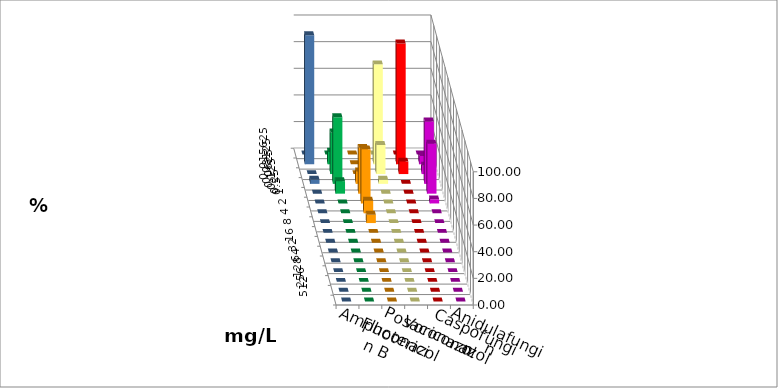
| Category | Amphotericin B | Fluconazol | Posaconazol | Voriconazol | Caspofungin | Anidulafungin |
|---|---|---|---|---|---|---|
| 0.015625 | 0 | 0 | 0 | 0 | 0 | 0 |
| 0.03125 | 9.375 | 0 | 75 | 90.625 | 6.25 | 96.875 |
| 0.0625 | 31.25 | 0 | 21.875 | 9.375 | 6.25 | 0 |
| 0.125 | 50 | 9.375 | 3.125 | 0 | 46.875 | 3.125 |
| 0.25 | 9.375 | 34.375 | 0 | 0 | 37.5 | 0 |
| 0.5 | 0 | 40.625 | 0 | 0 | 3.125 | 0 |
| 1.0 | 0 | 9.375 | 0 | 0 | 0 | 0 |
| 2.0 | 0 | 6.25 | 0 | 0 | 0 | 0 |
| 4.0 | 0 | 0 | 0 | 0 | 0 | 0 |
| 8.0 | 0 | 0 | 0 | 0 | 0 | 0 |
| 16.0 | 0 | 0 | 0 | 0 | 0 | 0 |
| 32.0 | 0 | 0 | 0 | 0 | 0 | 0 |
| 64.0 | 0 | 0 | 0 | 0 | 0 | 0 |
| 128.0 | 0 | 0 | 0 | 0 | 0 | 0 |
| 256.0 | 0 | 0 | 0 | 0 | 0 | 0 |
| 512.0 | 0 | 0 | 0 | 0 | 0 | 0 |